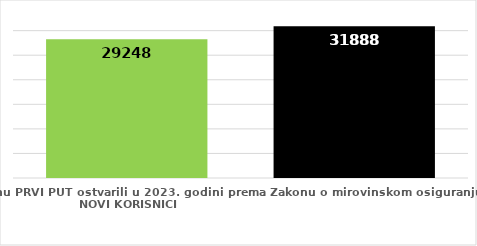
| Category | broj korisnika |
|---|---|
| Korisnici koji su pravo na mirovinu PRVI PUT ostvarili u 2023. godini prema Zakonu o mirovinskom osiguranju - NOVI KORISNICI | 29248 |
| Korisnici mirovina kojima je u 2023. godini PRESTALO PRAVO NA MIROVINU - uzrok smrt 
koji su pravo na mirovinu ostvarili prema Zakonu o mirovinskom osiguranju | 31888 |